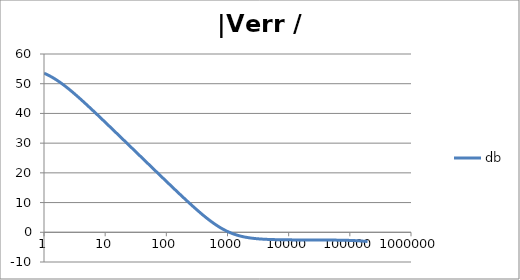
| Category | db |
|---|---|
| 1.0 | 53.539 |
| 1.0634378492473788 | 53.296 |
| 1.1309000592118907 | 53.036 |
| 1.2026419266820265 | 52.76 |
| 1.278934943925458 | 52.467 |
| 1.3600678260954062 | 52.159 |
| 1.4463476038134566 | 51.834 |
| 1.5381007850634825 | 51.494 |
| 1.6356745907936145 | 51.139 |
| 1.739438268902148 | 50.77 |
| 1.849784491579884 | 50.387 |
| 1.967130841296868 | 49.991 |
| 2.091921391056928 | 49.583 |
| 2.2246283849001642 | 49.163 |
| 2.365754025012901 | 48.733 |
| 2.5158323722080485 | 48.293 |
| 2.6754313669678584 | 47.844 |
| 2.8451549786972743 | 47.386 |
| 3.025645491321301 | 46.92 |
| 3.2175859338757533 | 46.448 |
| 3.42170266528945 | 45.969 |
| 3.6387681231394358 | 45.484 |
| 3.8696037467813236 | 44.994 |
| 4.115083085916729 | 44.5 |
| 4.376135106361553 | 44.001 |
| 4.653747705525078 | 43.498 |
| 4.948971450903514 | 42.991 |
| 5.262923555735513 | 42.482 |
| 5.596792106864742 | 41.97 |
| 5.951840560808945 | 41.455 |
| 6.329412525049976 | 40.939 |
| 6.730936842638569 | 40.42 |
| 7.157932999355504 | 39.899 |
| 7.612016873891456 | 39.377 |
| 8.094906852805886 | 38.854 |
| 8.608430333405762 | 38.329 |
| 9.154530639152917 | 37.804 |
| 9.735274373770007 | 37.277 |
| 10.352859241875105 | 36.749 |
| 11.009622365740512 | 36.221 |
| 11.708049129648925 | 35.692 |
| 12.4507825853165 | 35.163 |
| 13.240633453975693 | 34.633 |
| 14.080590762968805 | 34.102 |
| 14.973833157104059 | 33.571 |
| 15.923740927579823 | 33.04 |
| 16.93390880399795 | 32.508 |
| 18.008159557874837 | 31.977 |
| 19.150558469130036 | 31.444 |
| 20.365428710297824 | 30.912 |
| 21.65736770667993 | 30.38 |
| 23.031264534351347 | 29.847 |
| 24.492318421858034 | 29.314 |
| 26.046058425622668 | 28.782 |
| 27.698364353515743 | 28.249 |
| 29.45548901577305 | 27.716 |
| 31.32408188746347 | 27.183 |
| 33.311214272052936 | 26.65 |
| 35.42440606129053 | 26.117 |
| 37.67165419268462 | 25.584 |
| 40.06146291225952 | 25.051 |
| 42.60287595711691 | 24.518 |
| 45.30551077958928 | 23.985 |
| 48.17959494250036 | 23.453 |
| 51.23600482326248 | 22.92 |
| 54.486306773278585 | 22.388 |
| 57.94280088840825 | 21.855 |
| 61.61856755613799 | 21.323 |
| 65.52751695560372 | 20.792 |
| 69.68444169778837 | 20.26 |
| 74.10507280510043 | 19.729 |
| 78.80613924217637 | 19.198 |
| 83.8054312231895 | 18.668 |
| 89.12186753523771 | 18.138 |
| 94.77556713258299 | 17.609 |
| 100.78792527267464 | 17.08 |
| 107.18169448207877 | 16.552 |
| 113.98107065871142 | 16.025 |
| 121.21178463621371 | 15.498 |
| 128.90119955697148 | 14.973 |
| 137.07841442227294 | 14.449 |
| 145.77437421146283 | 13.926 |
| 155.02198698682062 | 13.404 |
| 164.85624842731968 | 12.884 |
| 175.3143742625403 | 12.366 |
| 186.43594110790573 | 11.85 |
| 198.26303623420247 | 11.336 |
| 210.84041683815525 | 10.825 |
| 224.21567941678887 | 10.317 |
| 238.43943988652958 | 9.811 |
| 253.56552512868072 | 9.31 |
| 269.65117668612646 | 8.812 |
| 286.75726738211927 | 8.319 |
| 304.9485316808965 | 7.831 |
| 324.2938106618788 | 7.348 |
| 344.8663125345048 | 6.871 |
| 366.7438896795682 | 6.401 |
| 390.00933326545766 | 5.938 |
| 414.7506865542229 | 5.483 |
| 441.06157808309626 | 5.036 |
| 469.0415759823428 | 4.599 |
| 498.7965647702637 | 4.172 |
| 530.4391460512702 | 3.756 |
| 564.089064633379 | 3.352 |
| 599.8736616776864 | 2.96 |
| 637.9283565946681 | 2.582 |
| 678.3971595109495 | 2.217 |
| 721.4332162458546 | 1.867 |
| 767.1993878601115 | 1.532 |
| 815.868866969862 | 1.213 |
| 867.6258331583267 | 0.91 |
| 922.6661499653554 | 0.623 |
| 981.1981060925172 | 0.352 |
| 1043.443203628628 | 0.098 |
| 1109.6369962786232 | -0.14 |
| 1180.0299807678607 | -0.362 |
| 1254.8885447951977 | -0.568 |
| 1334.4959751221782 | -0.759 |
| 1419.1535296132129 | -0.935 |
| 1509.1815772837017 | -1.097 |
| 1604.9208106703452 | -1.245 |
| 1706.7335351116335 | -1.381 |
| 1815.0050398174897 | -1.504 |
| 1930.1450559166665 | -1.616 |
| 2052.58930699948 | -1.718 |
| 2182.801158023697 | -1.81 |
| 2321.2733688234066 | -1.893 |
| 2468.5299588567814 | -1.967 |
| 2625.128190249376 | -2.034 |
| 2791.6606766374607 | -2.095 |
| 2968.757625791824 | -2.149 |
| 3157.08922450881 | -2.197 |
| 3357.3681747937244 | -2.24 |
| 3570.352390934236 | -2.279 |
| 3796.8478676703417 | -2.313 |
| 4037.7117303148448 | -2.344 |
| 4293.8554783669315 | -2.371 |
| 4566.248434893605 | -2.395 |
| 4855.9214147324665 | -2.417 |
| 5163.970625397384 | -2.436 |
| 5491.561815449236 | -2.453 |
| 5839.934686030357 | -2.468 |
| 6210.40758225729 | -2.481 |
| 6604.382482225307 | -2.493 |
| 7023.350302504747 | -2.504 |
| 7468.896540206577 | -2.513 |
| 7942.707272968458 | -2.522 |
| 8446.575539567106 | -2.529 |
| 8982.408125302747 | -2.536 |
| 9552.232777834151 | -2.542 |
| 10158.205880770249 | -2.547 |
| 10802.620614058389 | -2.552 |
| 11487.915632049675 | -2.556 |
| 12216.684292082227 | -2.56 |
| 12991.684468506162 | -2.563 |
| 13815.848989288772 | -2.566 |
| 14692.296734695852 | -2.569 |
| 15624.344440049217 | -2.571 |
| 16615.519247226184 | -2.574 |
| 17669.572052398642 | -2.576 |
| 18790.49170052441 | -2.578 |
| 19982.5200803064 | -2.58 |
| 21250.168176743602 | -2.582 |
| 22598.233142021272 | -2.584 |
| 24031.816449341983 | -2.586 |
| 25556.34319839602 | -2.588 |
| 27177.582645530147 | -2.59 |
| 28901.67003630542 | -2.592 |
| 30735.129823066054 | -2.594 |
| 32684.900355380338 | -2.597 |
| 34758.3601367905 | -2.599 |
| 36963.35574723439 | -2.602 |
| 39308.23153680468 | -2.605 |
| 41801.861203217486 | -2.608 |
| 44453.68137248706 | -2.612 |
| 47273.727309885995 | -2.616 |
| 50272.670896332245 | -2.621 |
| 53461.86101391677 | -2.626 |
| 56853.36649340195 | -2.632 |
| 60460.02178621637 | -2.638 |
| 64295.47553378361 | -2.646 |
| 68374.24221798431 | -2.654 |
| 72711.75708821259 | -2.663 |
| 77324.43457288652 | -2.673 |
| 82229.73039646025 | -2.685 |
| 87446.2076370035 | -2.698 |
| 92993.60697433475 | -2.713 |
| 98892.92139454243 | -2.73 |
| 105166.47563360249 | -2.749 |
| 111838.01066072512 | -2.77 |
| 118932.77352114675 | -2.793 |
| 126477.61287835392 | -2.82 |
| 134501.0806172993 | -2.85 |
| 143033.53989310883 | -2.884 |
| 152107.28003416685 | -2.921 |
| 161756.63873440344 | -2.964 |
| 172018.1319971993 | -3.011 |
| 182930.592322653 | -3.064 |
| 194535.31566115122 | -3.122 |